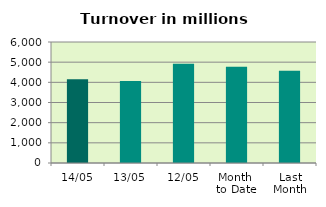
| Category | Series 0 |
|---|---|
| 14/05 | 4158.711 |
| 13/05 | 4066.003 |
| 12/05 | 4927.212 |
| Month 
to Date | 4778.737 |
| Last
Month | 4573.802 |